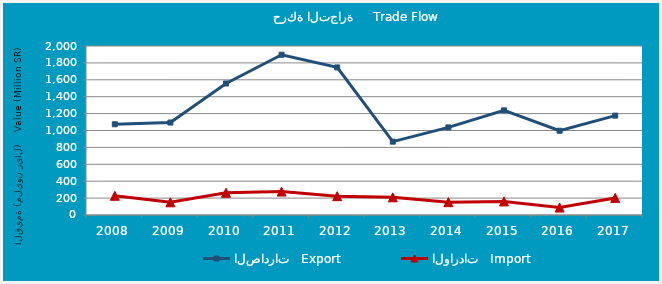
| Category | الصادرات   Export | الواردات   Import |
|---|---|---|
| 2008.0 | 1073754214 | 227408421 |
| 2009.0 | 1094118554 | 150166572 |
| 2010.0 | 1556322672 | 263137996 |
| 2011.0 | 1896759733 | 277292513 |
| 2012.0 | 1746605486 | 223005862 |
| 2013.0 | 867953017 | 209133826 |
| 2014.0 | 1036643266 | 151648168 |
| 2015.0 | 1238482647 | 160658555 |
| 2016.0 | 997079273 | 88090102 |
| 2017.0 | 1176085674 | 202313397 |